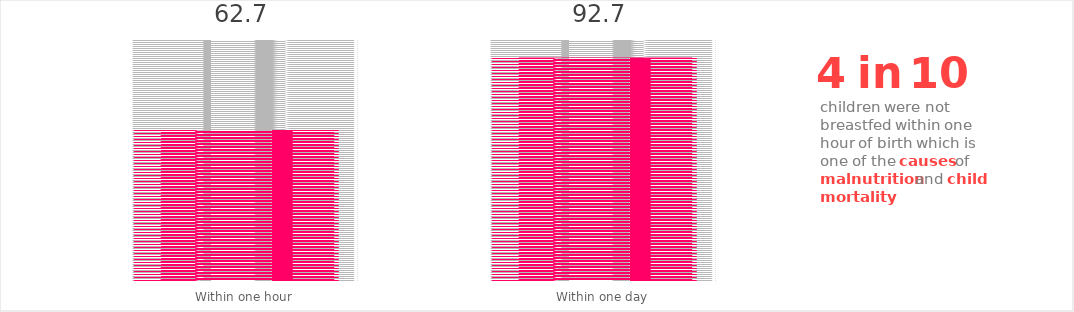
| Category | Series 1 |
|---|---|
| Within one hour | 100 |
| Within one day | 100 |